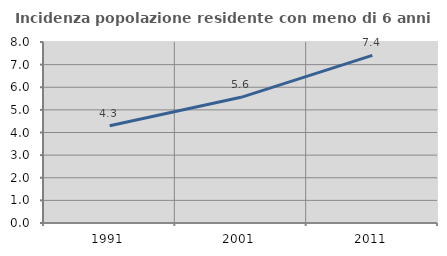
| Category | Incidenza popolazione residente con meno di 6 anni |
|---|---|
| 1991.0 | 4.298 |
| 2001.0 | 5.556 |
| 2011.0 | 7.407 |